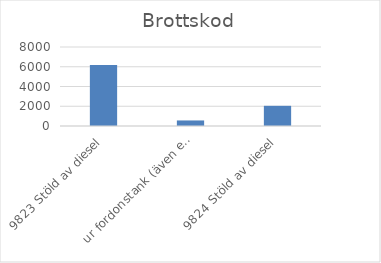
| Category | Summa |
|---|---|
| 9823 Stöld av diesel, ur fordonstank (även entreprenadmaskin m.m.) | 6181 |
| 9824 Stöld av diesel, ur större tankar (ej kopplade till fordon) | 562 |
| 9825 Stöld av drivmedel (även diesel), ej genom smitning | 2044 |